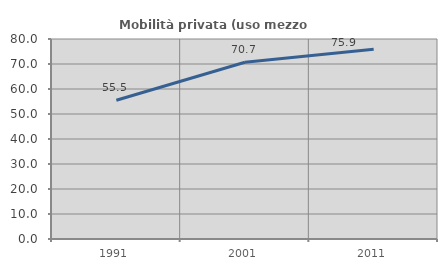
| Category | Mobilità privata (uso mezzo privato) |
|---|---|
| 1991.0 | 55.511 |
| 2001.0 | 70.678 |
| 2011.0 | 75.924 |